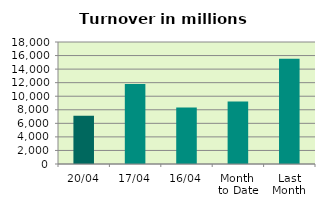
| Category | Series 0 |
|---|---|
| 20/04 | 7115.861 |
| 17/04 | 11811.464 |
| 16/04 | 8331.043 |
| Month 
to Date | 9206.836 |
| Last
Month | 15518.097 |